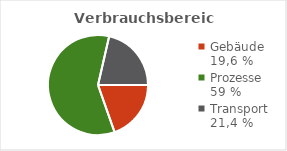
| Category | Energieverbrauchsbereiche |
|---|---|
| Gebäude
19,6 % | 4568000 |
| Prozesse
59 % | 13731067.567 |
| Transport
21,4 % | 4984535 |